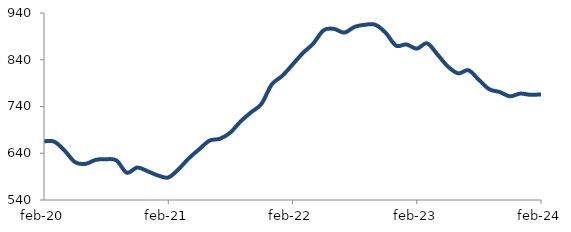
| Category | Series 0 |
|---|---|
| 2020-02-01 | 665.471 |
| 2020-03-01 | 664.712 |
| 2020-04-01 | 645.351 |
| 2020-05-01 | 620.935 |
| 2020-06-01 | 617.256 |
| 2020-07-01 | 625.855 |
| 2020-08-01 | 627.288 |
| 2020-09-01 | 624.542 |
| 2020-10-01 | 598.351 |
| 2020-11-01 | 609.465 |
| 2020-12-01 | 601.605 |
| 2021-01-01 | 592.504 |
| 2021-02-01 | 588.185 |
| 2021-03-01 | 605.989 |
| 2021-04-01 | 629.446 |
| 2021-05-01 | 648.73 |
| 2021-06-01 | 667.177 |
| 2021-07-01 | 670.996 |
| 2021-08-01 | 684.389 |
| 2021-09-01 | 708.308 |
| 2021-10-01 | 727.608 |
| 2021-11-01 | 745.65 |
| 2021-12-01 | 787.184 |
| 2022-01-01 | 805.308 |
| 2022-02-01 | 829.502 |
| 2022-03-01 | 854.336 |
| 2022-04-01 | 874.453 |
| 2022-05-01 | 903.049 |
| 2022-06-01 | 906.022 |
| 2022-07-01 | 898.071 |
| 2022-08-01 | 910.353 |
| 2022-09-01 | 914.859 |
| 2022-10-01 | 914.857 |
| 2022-11-01 | 897.607 |
| 2022-12-01 | 870.196 |
| 2023-01-01 | 872.784 |
| 2023-02-01 | 863.736 |
| 2023-03-01 | 875.118 |
| 2023-04-01 | 851.276 |
| 2023-05-01 | 825.667 |
| 2023-06-01 | 810.924 |
| 2023-07-01 | 817.469 |
| 2023-08-01 | 797.001 |
| 2023-09-01 | 777.024 |
| 2023-10-01 | 770.975 |
| 2023-11-01 | 761.798 |
| 2023-12-01 | 767.626 |
| 2024-01-01 | 764.98 |
| 2024-02-01 | 765.887 |